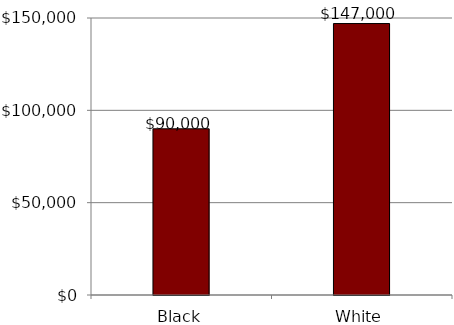
| Category | Series 0 |
|---|---|
| Black | 90000 |
| White | 147000 |